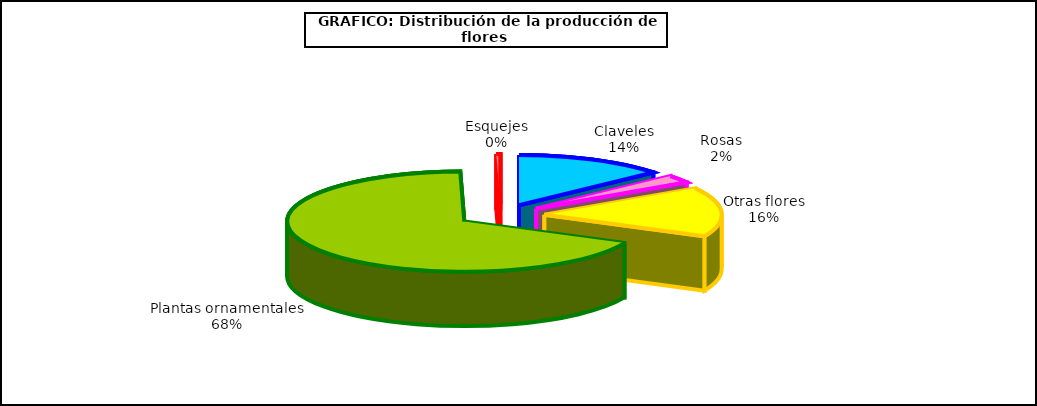
| Category | Series 0 |
|---|---|
| 0 | 60277 |
| 1 | 10897 |
| 2 | 69989 |
| 3 | 297707 |
| 4 | 1618 |